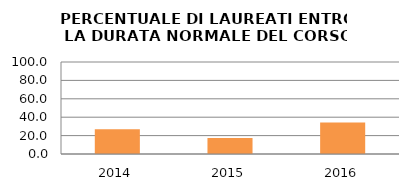
| Category | 2014 2015 2016 |
|---|---|
| 2014.0 | 26.786 |
| 2015.0 | 17.391 |
| 2016.0 | 34.146 |